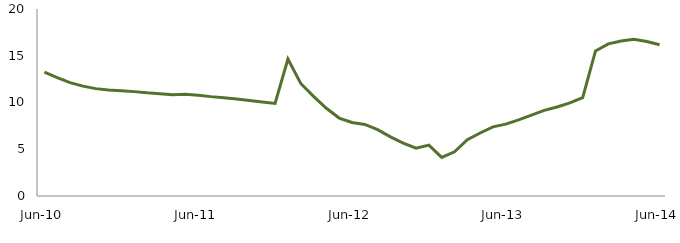
| Category | Series 0 |
|---|---|
| Jun-10 | 13.24 |
|  | 12.669 |
|  | 12.128 |
|  | 11.747 |
|  | 11.483 |
|  | 11.344 |
|  | 11.256 |
|  | 11.163 |
|  | 11.031 |
|  | 10.935 |
|  | 10.818 |
|  | 10.872 |
| Jun-11 | 10.784 |
|  | 10.628 |
|  | 10.504 |
|  | 10.374 |
|  | 10.212 |
|  | 10.043 |
|  | 9.898 |
|  | 14.655 |
|  | 12.038 |
|  | 10.656 |
|  | 9.383 |
|  | 8.337 |
| Jun-12 | 7.859 |
|  | 7.654 |
|  | 7.095 |
|  | 6.329 |
|  | 5.655 |
|  | 5.108 |
|  | 5.447 |
|  | 4.125 |
|  | 4.723 |
|  | 6.024 |
|  | 6.741 |
|  | 7.399 |
| Jun-13 | 7.69 |
|  | 8.139 |
|  | 8.641 |
|  | 9.159 |
|  | 9.523 |
|  | 9.953 |
|  | 10.521 |
|  | 15.512 |
|  | 16.267 |
|  | 16.584 |
|  | 16.774 |
|  | 16.523 |
| Jun-14 | 16.177 |